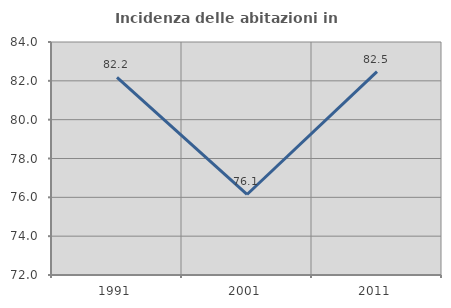
| Category | Incidenza delle abitazioni in proprietà  |
|---|---|
| 1991.0 | 82.178 |
| 2001.0 | 76.147 |
| 2011.0 | 82.474 |